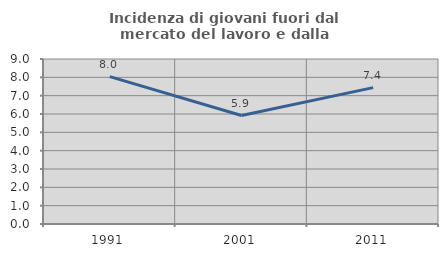
| Category | Incidenza di giovani fuori dal mercato del lavoro e dalla formazione  |
|---|---|
| 1991.0 | 8.036 |
| 2001.0 | 5.915 |
| 2011.0 | 7.438 |